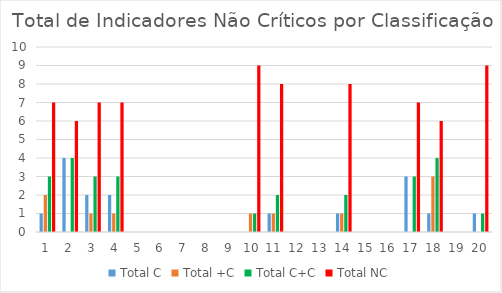
| Category | Total C | Total +C | Total C+C | Total NC |
|---|---|---|---|---|
| 0 | 1 | 2 | 3 | 7 |
| 1 | 4 | 0 | 4 | 6 |
| 2 | 2 | 1 | 3 | 7 |
| 3 | 2 | 1 | 3 | 7 |
| 4 | 0 | 0 | 0 | 0 |
| 5 | 0 | 0 | 0 | 0 |
| 6 | 0 | 0 | 0 | 0 |
| 7 | 0 | 0 | 0 | 0 |
| 8 | 0 | 0 | 0 | 0 |
| 9 | 0 | 1 | 1 | 9 |
| 10 | 1 | 1 | 2 | 8 |
| 11 | 0 | 0 | 0 | 0 |
| 12 | 0 | 0 | 0 | 0 |
| 13 | 1 | 1 | 2 | 8 |
| 14 | 0 | 0 | 0 | 0 |
| 15 | 0 | 0 | 0 | 0 |
| 16 | 3 | 0 | 3 | 7 |
| 17 | 1 | 3 | 4 | 6 |
| 18 | 0 | 0 | 0 | 0 |
| 19 | 1 | 0 | 1 | 9 |